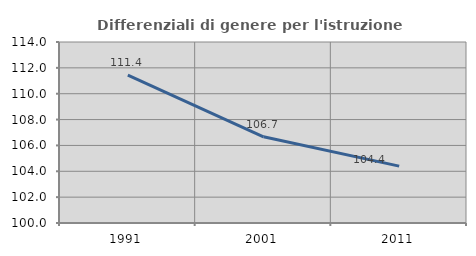
| Category | Differenziali di genere per l'istruzione superiore |
|---|---|
| 1991.0 | 111.444 |
| 2001.0 | 106.667 |
| 2011.0 | 104.399 |